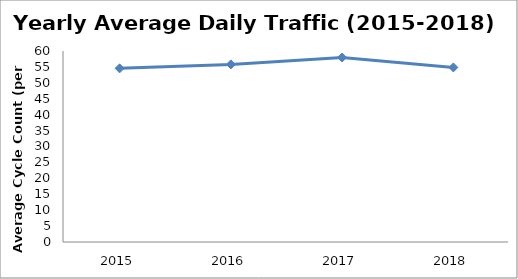
| Category | Series 0 |
|---|---|
| 2015.0 | 54.551 |
| 2016.0 | 55.787 |
| 2017.0 | 57.953 |
| 2018.0 | 54.844 |